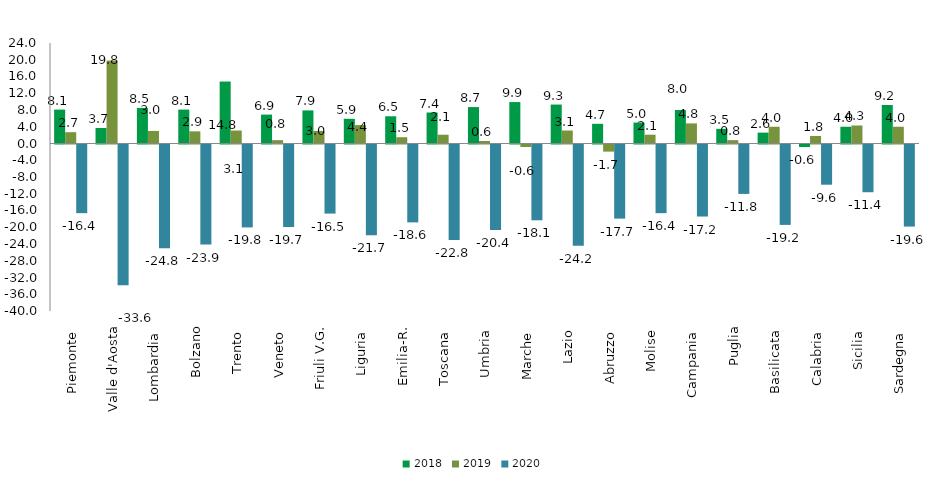
| Category | 2018 | 2019 | 2020 |
|---|---|---|---|
| Piemonte  | 8.1 | 2.7 | -16.4 |
| Valle d'Aosta | 3.7 | 19.8 | -33.6 |
| Lombardia  | 8.5 | 3 | -24.8 |
| Bolzano | 8.1 | 2.9 | -23.9 |
| Trento  | 14.8 | 3.1 | -19.8 |
| Veneto  | 6.9 | 0.8 | -19.7 |
| Friuli V.G. | 7.9 | 3 | -16.5 |
| Liguria  | 5.9 | 4.4 | -21.7 |
| Emilia-R. | 6.5 | 1.5 | -18.6 |
| Toscana  | 7.4 | 2.1 | -22.8 |
| Umbria  | 8.7 | 0.6 | -20.4 |
| Marche  | 9.9 | -0.6 | -18.1 |
| Lazio  | 9.3 | 3.1 | -24.2 |
| Abruzzo  | 4.7 | -1.7 | -17.7 |
| Molise  | 5 | 2.1 | -16.4 |
| Campania  | 8 | 4.8 | -17.2 |
| Puglia | 3.5 | 0.8 | -11.8 |
| Basilicata  | 2.6 | 4 | -19.2 |
| Calabria  | -0.6 | 1.8 | -9.6 |
| Sicilia  | 4 | 4.3 | -11.4 |
| Sardegna  | 9.2 | 4 | -19.6 |